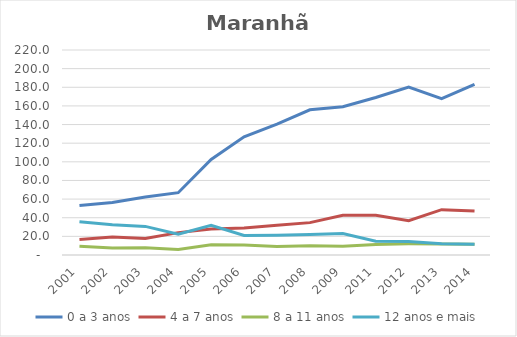
| Category | 0 a 3 anos | 4 a 7 anos | 8 a 11 anos | 12 anos e mais |
|---|---|---|---|---|
| 2001.0 | 53.249 | 16.743 | 9.437 | 35.792 |
| 2002.0 | 56.443 | 19.22 | 7.454 | 32.592 |
| 2003.0 | 62.152 | 17.737 | 7.754 | 30.704 |
| 2004.0 | 66.871 | 24.019 | 5.788 | 22.406 |
| 2005.0 | 102.579 | 27.776 | 10.964 | 31.862 |
| 2006.0 | 126.833 | 29.036 | 10.735 | 20.903 |
| 2007.0 | 140.343 | 31.934 | 9.168 | 21.257 |
| 2008.0 | 155.837 | 34.74 | 10.04 | 21.872 |
| 2009.0 | 159.107 | 42.709 | 9.464 | 23.132 |
| 2011.0 | 169.079 | 42.538 | 11.295 | 14.799 |
| 2012.0 | 180.207 | 36.75 | 11.965 | 14.57 |
| 2013.0 | 167.866 | 48.681 | 11.904 | 12.188 |
| 2014.0 | 183.082 | 47.168 | 11.631 | 11.595 |